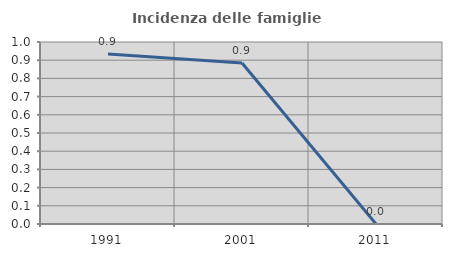
| Category | Incidenza delle famiglie numerose |
|---|---|
| 1991.0 | 0.935 |
| 2001.0 | 0.885 |
| 2011.0 | 0 |